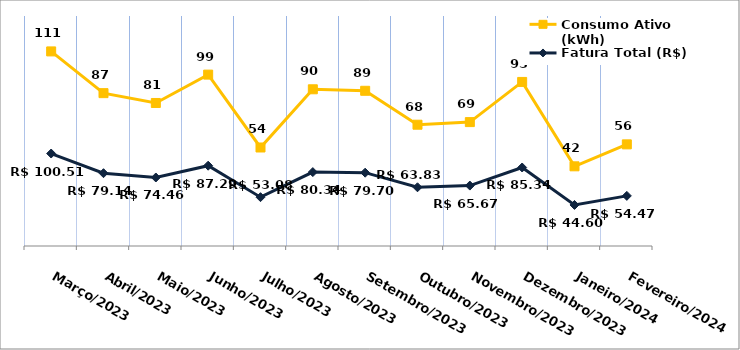
| Category | Fatura Total (R$) | Consumo Ativo (kWh) |
|---|---|---|
| Março/2023 | 100.51 | 111 |
| Abril/2023 | 79.14 | 87 |
| Maio/2023 | 74.46 | 81 |
| Junho/2023 | 87.29 | 99 |
| Julho/2023 | 53.08 | 54 |
| Agosto/2023 | 80.34 | 90 |
| Setembro/2023 | 79.7 | 89 |
| Outubro/2023 | 63.83 | 68 |
| Novembro/2023 | 65.67 | 69 |
| Dezembro/2023 | 85.34 | 93 |
| Janeiro/2024 | 44.6 | 42 |
| Fevereiro/2024 | 54.47 | 56 |